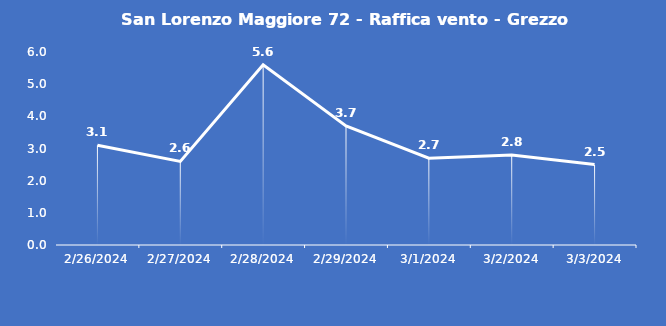
| Category | San Lorenzo Maggiore 72 - Raffica vento - Grezzo (m/s) |
|---|---|
| 2/26/24 | 3.1 |
| 2/27/24 | 2.6 |
| 2/28/24 | 5.6 |
| 2/29/24 | 3.7 |
| 3/1/24 | 2.7 |
| 3/2/24 | 2.8 |
| 3/3/24 | 2.5 |